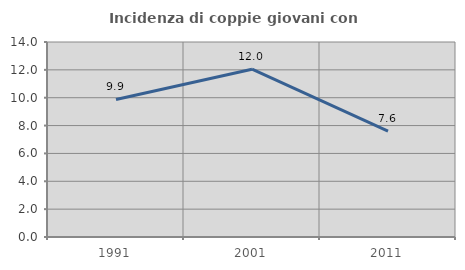
| Category | Incidenza di coppie giovani con figli |
|---|---|
| 1991.0 | 9.877 |
| 2001.0 | 12.048 |
| 2011.0 | 7.595 |